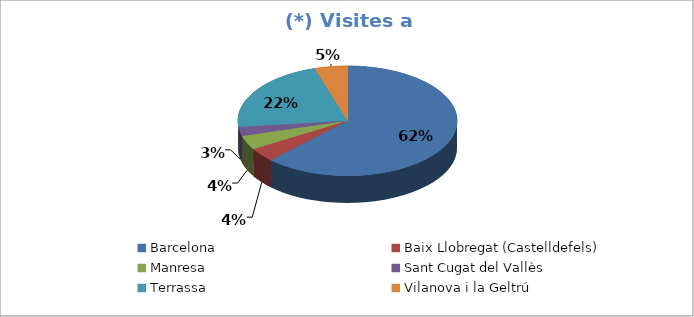
| Category | Series 0 |
|---|---|
| Barcelona | 0.623 |
| Baix Llobregat (Castelldefels) | 0.041 |
| Manresa | 0.042 |
| Sant Cugat del Vallès | 0.027 |
| Terrassa | 0.22 |
| Vilanova i la Geltrú | 0.049 |